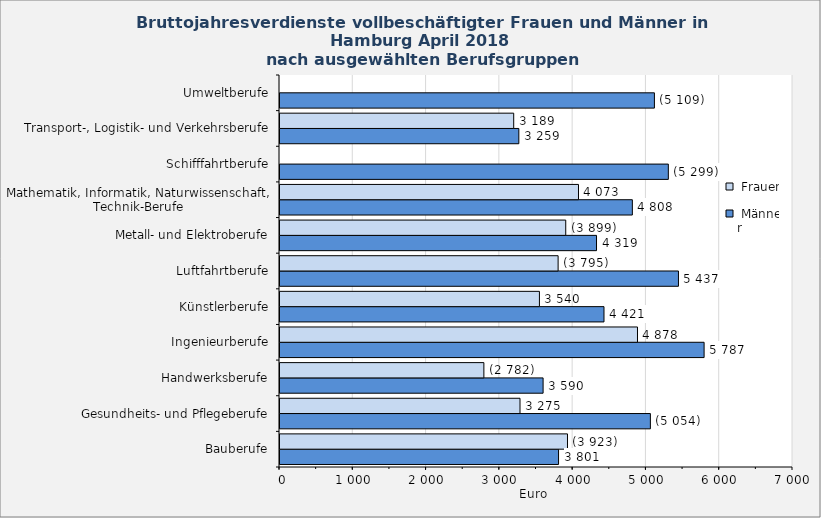
| Category |  Männer |  Frauen |
|---|---|---|
| Bauberufe | 3801 | 3923 |
| Gesundheits- und Pflegeberufe | 5054 | 3275 |
| Handwerksberufe | 3590 | 2782 |
| Ingenieurberufe | 5787 | 4878 |
| Künstlerberufe | 4421 | 3540 |
| Luftfahrtberufe | 5437 | 3795 |
| Metall- und Elektroberufe | 4319 | 3899 |
| Mathematik, Informatik, Naturwissenschaft, Technik-Berufe | 4808 | 4073 |
| Schifffahrtberufe | 5299 | 0 |
| Transport-, Logistik- und Verkehrsberufe | 3259 | 3189 |
| Umweltberufe | 5109 | 0 |